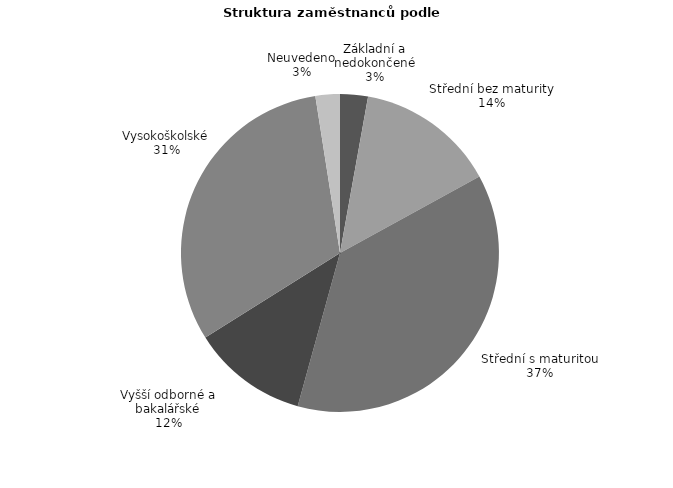
| Category | Series 0 |
|---|---|
| Základní a nedokončené | 18.576 |
| Střední bez maturity | 93.071 |
| Střední s maturitou | 244.762 |
| Vyšší odborné a bakalářské | 77.344 |
| Vysokoškolské | 206.449 |
| Neuvedeno | 16.29 |